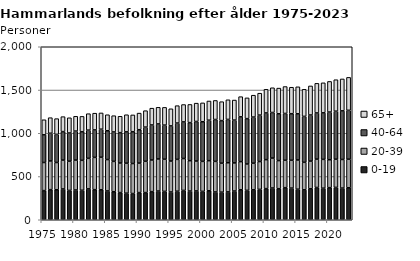
| Category | 0-19 | 20-39 | 40-64 | 65+ |
|---|---|---|---|---|
| 1975.0 | 337 | 325 | 320 | 174 |
| 1976.0 | 348 | 332 | 320 | 180 |
| 1977.0 | 347 | 315 | 325 | 182 |
| 1978.0 | 356 | 334 | 329 | 173 |
| 1979.0 | 339 | 338 | 326 | 176 |
| 1980.0 | 344 | 346 | 335 | 171 |
| 1981.0 | 341 | 346 | 331 | 177 |
| 1982.0 | 357 | 353 | 326 | 190 |
| 1983.0 | 348 | 373 | 318 | 193 |
| 1984.0 | 347 | 376 | 324 | 188 |
| 1985.0 | 333 | 363 | 333 | 185 |
| 1986.0 | 324 | 351 | 340 | 188 |
| 1987.0 | 314 | 342 | 351 | 189 |
| 1988.0 | 307 | 347 | 362 | 198 |
| 1989.0 | 303 | 347 | 368 | 194 |
| 1990.0 | 314 | 341 | 386 | 192 |
| 1991.0 | 314 | 362 | 395 | 190 |
| 1992.0 | 325 | 366 | 405 | 194 |
| 1993.0 | 332 | 371 | 405 | 192 |
| 1994.0 | 328 | 372 | 394 | 205 |
| 1995.0 | 321 | 358 | 406 | 198 |
| 1996.0 | 330 | 368 | 420 | 201 |
| 1997.0 | 339 | 369 | 423 | 201 |
| 1998.0 | 332 | 351 | 440 | 210 |
| 1999.0 | 333 | 346 | 457 | 212 |
| 2000.0 | 328 | 347 | 458 | 218 |
| 2001.0 | 335 | 348 | 468 | 222 |
| 2002.0 | 321 | 354 | 484 | 220 |
| 2003.0 | 319 | 335 | 492 | 219 |
| 2004.0 | 322 | 337 | 501 | 227 |
| 2005.0 | 332 | 325 | 495 | 232 |
| 2006.0 | 347 | 325 | 518 | 233 |
| 2007.0 | 340 | 305 | 524 | 240 |
| 2008.0 | 346 | 308 | 533 | 253 |
| 2009.0 | 351 | 322 | 537 | 253 |
| 2010.0 | 360 | 335 | 540 | 273 |
| 2011.0 | 367 | 346 | 527 | 286 |
| 2012.0 | 359 | 325 | 541 | 297 |
| 2013.0 | 371 | 317 | 541 | 311 |
| 2014.0 | 366 | 322 | 538 | 306 |
| 2015.0 | 353 | 338 | 534 | 312 |
| 2016.0 | 346 | 318 | 531 | 313 |
| 2017.0 | 358 | 320 | 533 | 336 |
| 2018.0 | 373 | 328 | 534 | 342 |
| 2019.0 | 365 | 333 | 538 | 347 |
| 2020.0 | 371 | 323 | 551 | 354 |
| 2021.0 | 374 | 326 | 555 | 364 |
| 2022.0 | 366 | 331 | 562 | 369 |
| 2023.0 | 370 | 330 | 565 | 381 |